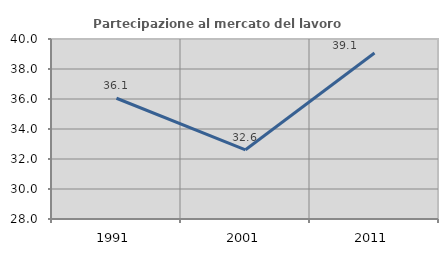
| Category | Partecipazione al mercato del lavoro  femminile |
|---|---|
| 1991.0 | 36.051 |
| 2001.0 | 32.612 |
| 2011.0 | 39.07 |